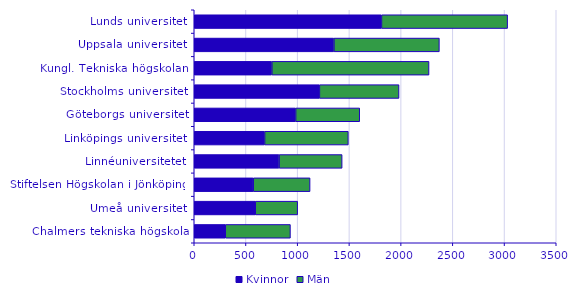
| Category | Kvinnor | Män |
|---|---|---|
| Chalmers tekniska högskola | 300 | 630 |
| Umeå universitet | 590 | 410 |
| Stiftelsen Högskolan i Jönköping | 570 | 550 |
| Linnéuniversitetet | 820 | 610 |
| Linköpings universitet | 680 | 810 |
| Göteborgs universitet | 980 | 620 |
| Stockholms universitet | 1210 | 770 |
| Kungl. Tekniska högskolan | 750 | 1520 |
| Uppsala universitet | 1350 | 1020 |
| Lunds universitet | 1810 | 1220 |